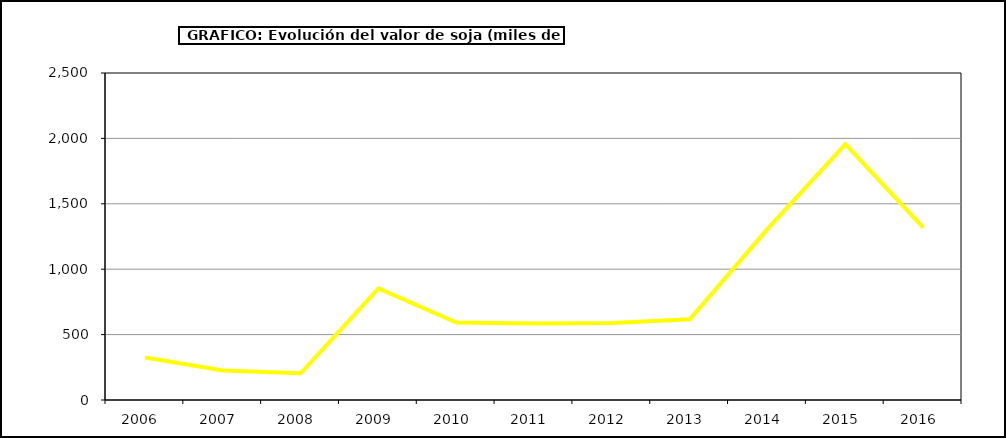
| Category | Valor |
|---|---|
| 2006.0 | 324.61 |
| 2007.0 | 225.216 |
| 2008.0 | 204.204 |
| 2009.0 | 853.62 |
| 2010.0 | 592.162 |
| 2011.0 | 584.814 |
| 2012.0 | 588.253 |
| 2013.0 | 616.743 |
| 2014.0 | 1308.04 |
| 2015.0 | 1956 |
| 2016.0 | 1317 |